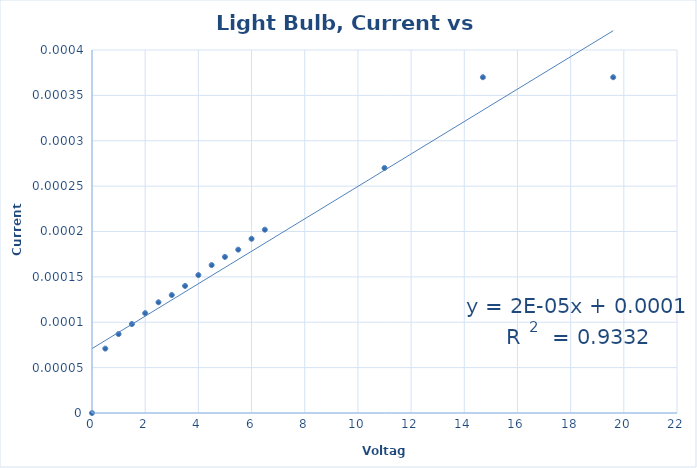
| Category | Series 0 |
|---|---|
| 0.5 | 0 |
| 1.0 | 0 |
| 1.5 | 0 |
| 2.0 | 0 |
| 2.5 | 0 |
| 3.0 | 0 |
| 3.5 | 0 |
| 4.0 | 0 |
| 4.5 | 0 |
| 5.0 | 0 |
| 5.5 | 0 |
| 6.0 | 0 |
| 6.5 | 0 |
| 11.0 | 0 |
| 14.7 | 0 |
| 19.6 | 0 |
| 0.0 | 0 |